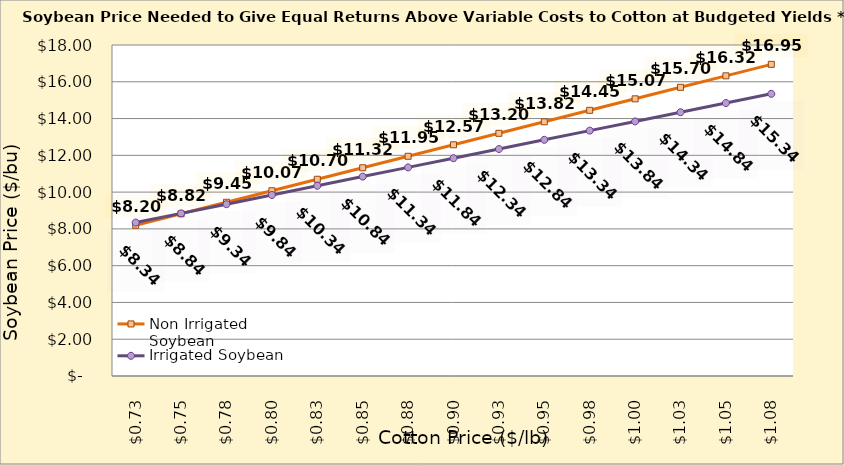
| Category | Non Irrigated Soybean | Irrigated Soybean |
|---|---|---|
| 0.7249999999999999 | 8.198 | 8.344 |
| 0.7499999999999999 | 8.823 | 8.844 |
| 0.7749999999999999 | 9.448 | 9.344 |
| 0.7999999999999999 | 10.073 | 9.844 |
| 0.825 | 10.698 | 10.344 |
| 0.85 | 11.323 | 10.844 |
| 0.875 | 11.948 | 11.344 |
| 0.9 | 12.573 | 11.844 |
| 0.925 | 13.198 | 12.344 |
| 0.9500000000000001 | 13.823 | 12.844 |
| 0.9750000000000001 | 14.448 | 13.344 |
| 1.0 | 15.073 | 13.844 |
| 1.025 | 15.698 | 14.344 |
| 1.0499999999999998 | 16.323 | 14.844 |
| 1.0749999999999997 | 16.948 | 15.344 |